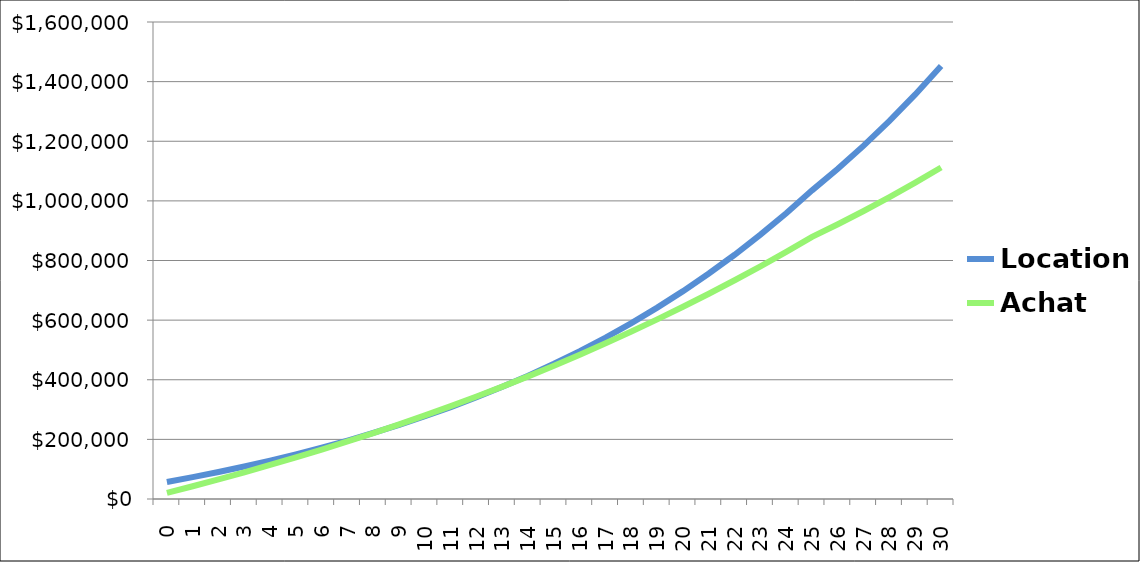
| Category | Location | Achat |
|---|---|---|
| 0.0 | 57000 | 20579.375 |
| 1.0 | 73316.715 | 42811.282 |
| 2.0 | 90689.599 | 65798.326 |
| 3.0 | 109190.866 | 89567.338 |
| 4.0 | 128897.746 | 114146.138 |
| 5.0 | 149892.845 | 139563.571 |
| 6.0 | 172264.511 | 165849.546 |
| 7.0 | 196107.243 | 193035.079 |
| 8.0 | 221522.116 | 221152.331 |
| 9.0 | 248617.244 | 250234.654 |
| 10.0 | 277508.267 | 280316.634 |
| 11.0 | 308318.885 | 311434.143 |
| 12.0 | 341181.412 | 343624.381 |
| 13.0 | 376237.385 | 376925.931 |
| 14.0 | 413638.208 | 411378.811 |
| 15.0 | 453545.839 | 447024.528 |
| 16.0 | 496133.528 | 483906.133 |
| 17.0 | 541586.611 | 522068.284 |
| 18.0 | 590103.351 | 561557.305 |
| 19.0 | 641895.841 | 602421.249 |
| 20.0 | 697190.976 | 644709.965 |
| 21.0 | 756231.485 | 688475.166 |
| 22.0 | 819277.039 | 733770.502 |
| 23.0 | 886605.433 | 780651.632 |
| 24.0 | 958513.861 | 829176.301 |
| 25.0 | 1035320.266 | 879404.423 |
| 26.0 | 1107792.685 | 921635.206 |
| 27.0 | 1185338.173 | 965907.95 |
| 28.0 | 1268311.845 | 1012326.203 |
| 29.0 | 1357093.674 | 1060999.131 |
| 30.0 | 1452090.231 | 1112041.838 |